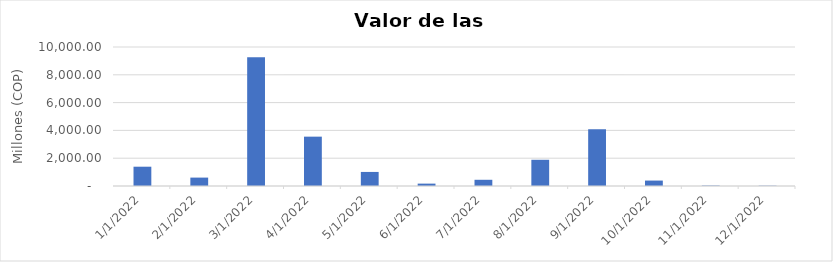
| Category | Valor Importaciones (COP) |
|---|---|
| 1/1/22 | 1388.243 |
| 2/1/22 | 604.424 |
| 3/1/22 | 9262.442 |
| 4/1/22 | 3550.163 |
| 5/1/22 | 1011.632 |
| 6/1/22 | 171.241 |
| 7/1/22 | 446.985 |
| 8/1/22 | 1886.937 |
| 9/1/22 | 4087.156 |
| 10/1/22 | 390.82 |
| 11/1/22 | 29.922 |
| 12/1/22 | 19.807 |